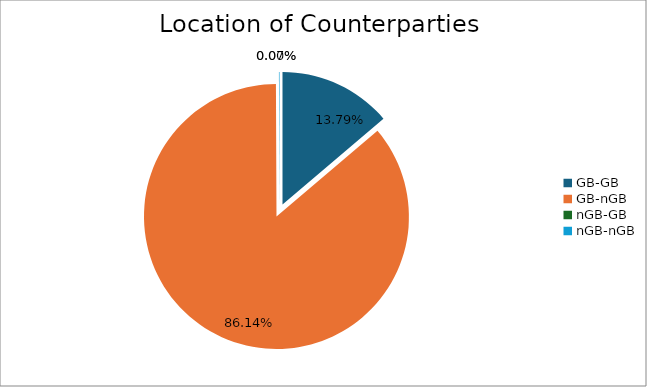
| Category | Series 0 |
|---|---|
| GB-GB | 1282001.143 |
| GB-nGB | 8010225.194 |
| nGB-GB | 0 |
| nGB-nGB | 6391.951 |